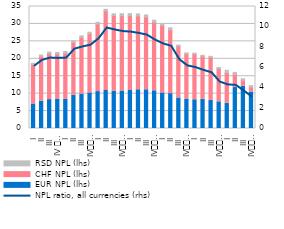
| Category | EUR NPL (lhs) | CHF NPL (lhs) | RSD NPL (lhs) |
|---|---|---|---|
| I | 7.031 | 11.315 | 0.376 |
| II | 7.838 | 12.854 | 0.398 |
| III | 8.287 | 13.256 | 0.398 |
| IV 
2013 | 8.472 | 12.907 | 0.424 |
| I | 8.364 | 13.289 | 0.434 |
| II | 9.502 | 15.183 | 0.445 |
| III | 9.861 | 16.293 | 0.431 |
| IV
2014 | 10.2 | 16.966 | 0.464 |
| I | 10.588 | 19.402 | 0.479 |
| II | 10.907 | 22.828 | 0.467 |
| III | 10.661 | 21.759 | 0.479 |
| IV
2015 | 10.774 | 21.561 | 0.595 |
| I | 10.906 | 21.449 | 0.603 |
| II | 11.118 | 21.151 | 0.6 |
| III | 11.109 | 20.882 | 0.585 |
| IV
2016 | 10.82 | 19.717 | 0.539 |
| I | 10.204 | 19.386 | 0.539 |
| II | 10.002 | 18.325 | 0.564 |
| III | 8.771 | 14.875 | 0.29 |
| IV
2017 | 8.337 | 13.073 | 0.274 |
| I | 8.247 | 13.09 | 0.266 |
| II | 8.373 | 12.384 | 0.241 |
| III | 8.081 | 12.357 | 0.265 |
| IV
2018 | 7.649 | 9.577 | 0.27 |
| I | 7.26 | 8.704 | 0.728 |
| II | 11.747 | 3.816 | 0.533 |
| III | 12.162 | 1.673 | 0.43 |
| IV
2019 | 10.454 | 1.442 | 0.401 |